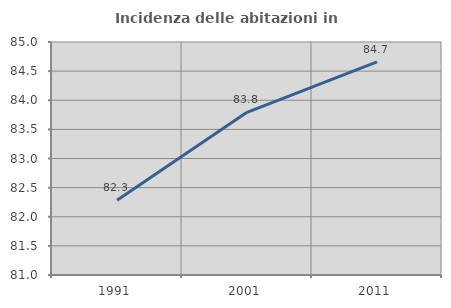
| Category | Incidenza delle abitazioni in proprietà  |
|---|---|
| 1991.0 | 82.283 |
| 2001.0 | 83.793 |
| 2011.0 | 84.66 |